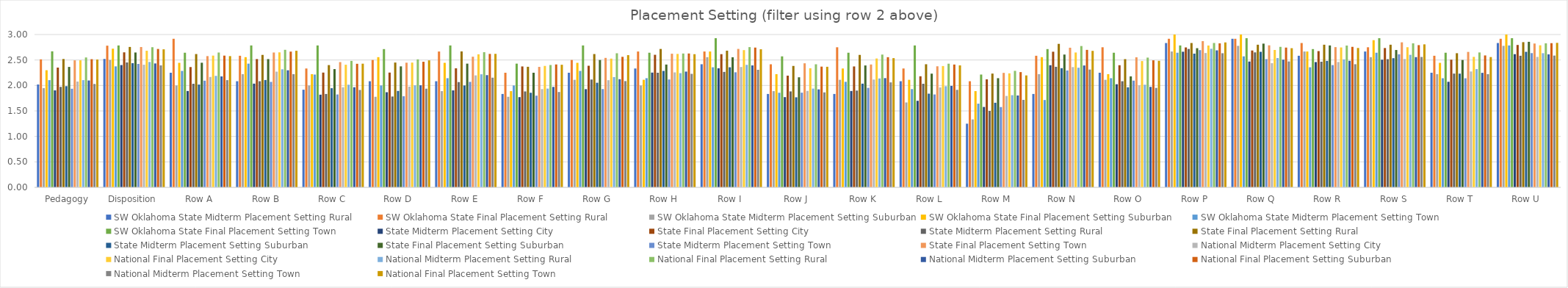
| Category | SW Oklahoma State | State | National |
|---|---|---|---|
| Pedagogy | 2.67 | 2.493 | 2.509 |
| Disposition | 2.786 | 2.754 | 2.71 |
| Row A | 2.643 | 2.576 | 2.576 |
| Row B | 2.786 | 2.647 | 2.681 |
| Row C | 2.786 | 2.459 | 2.428 |
| Row D | 2.714 | 2.447 | 2.493 |
| Row E | 2.786 | 2.565 | 2.62 |
| Row F | 2.429 | 2.365 | 2.407 |
| Row G | 2.786 | 2.541 | 2.595 |
| Row H | 2.643 | 2.624 | 2.614 |
| Row I | 2.929 | 2.718 | 2.711 |
| Row J | 2.571 | 2.435 | 2.367 |
| Row K | 2.643 | 2.412 | 2.537 |
| Row L | 2.786 | 2.376 | 2.394 |
| Row M | 2.214 | 2.247 | 2.197 |
| Row N | 2.714 | 2.741 | 2.679 |
| Row O | 2.643 | 2.553 | 2.484 |
| Row P | 2.786 | 2.871 | 2.845 |
| Row Q | 2.929 | 2.788 | 2.732 |
| Row R | 2.714 | 2.753 | 2.736 |
| Row S | 2.929 | 2.847 | 2.807 |
| Row T | 2.643 | 2.659 | 2.558 |
| Row U | 2.929 | 2.824 | 2.836 |